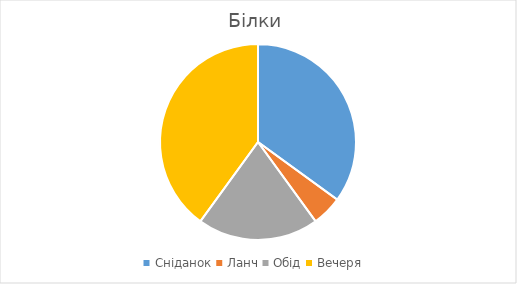
| Category | Білки |
|---|---|
| Сніданок | 35 |
| Ланч | 5 |
| Обід | 20 |
| Вечеря | 40 |